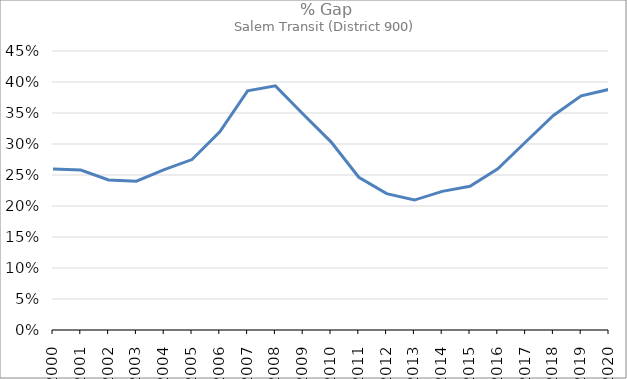
| Category | Series 0 |
|---|---|
| 2000.0 | 0.26 |
| 2001.0 | 0.258 |
| 2002.0 | 0.242 |
| 2003.0 | 0.24 |
| 2004.0 | 0.259 |
| 2005.0 | 0.275 |
| 2006.0 | 0.32 |
| 2007.0 | 0.386 |
| 2008.0 | 0.394 |
| 2009.0 | 0.348 |
| 2010.0 | 0.304 |
| 2011.0 | 0.246 |
| 2012.0 | 0.22 |
| 2013.0 | 0.21 |
| 2014.0 | 0.224 |
| 2015.0 | 0.232 |
| 2016.0 | 0.26 |
| 2017.0 | 0.303 |
| 2018.0 | 0.346 |
| 2019.0 | 0.378 |
| 2020.0 | 0.388 |